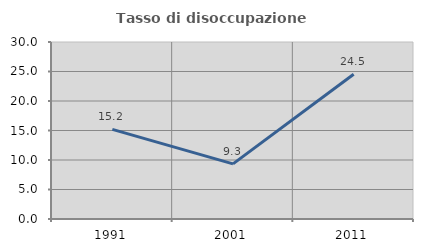
| Category | Tasso di disoccupazione giovanile  |
|---|---|
| 1991.0 | 15.188 |
| 2001.0 | 9.338 |
| 2011.0 | 24.547 |